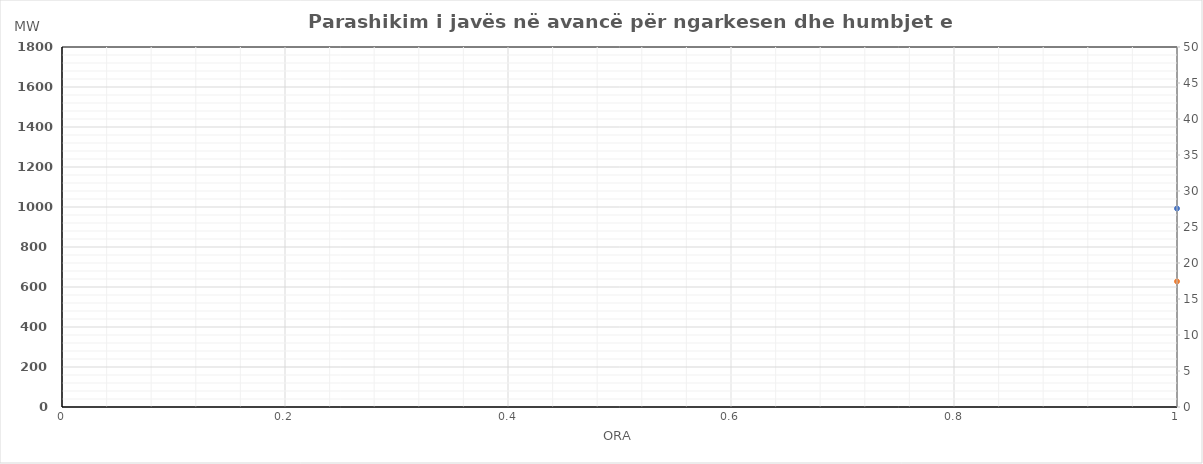
| Category | Ngarkesa (MWh) |
|---|---|
| 0 | 627.937 |
| 1 | 544.82 |
| 2 | 505.534 |
| 3 | 494.173 |
| 4 | 499.324 |
| 5 | 563.603 |
| 6 | 755.438 |
| 7 | 1010.254 |
| 8 | 1121.056 |
| 9 | 1144.751 |
| 10 | 1128.008 |
| 11 | 1115.397 |
| 12 | 1130.338 |
| 13 | 1166.992 |
| 14 | 1198.143 |
| 15 | 1212.175 |
| 16 | 1253.99 |
| 17 | 1311.956 |
| 18 | 1312.097 |
| 19 | 1300.361 |
| 20 | 1265.792 |
| 21 | 1157.814 |
| 22 | 985.576 |
| 23 | 784.612 |
| 24 | 646.145 |
| 25 | 568.616 |
| 26 | 531.638 |
| 27 | 518.668 |
| 28 | 525.293 |
| 29 | 589.999 |
| 30 | 788.249 |
| 31 | 1071.961 |
| 32 | 1162.219 |
| 33 | 1146.982 |
| 34 | 1109.085 |
| 35 | 1078.535 |
| 36 | 1058.867 |
| 37 | 1084.38 |
| 38 | 1112.88 |
| 39 | 1142.433 |
| 40 | 1231.431 |
| 41 | 1357.425 |
| 42 | 1386.465 |
| 43 | 1384.973 |
| 44 | 1348.599 |
| 45 | 1230.955 |
| 46 | 1033.728 |
| 47 | 824.857 |
| 48 | 672.078 |
| 49 | 584.835 |
| 50 | 545.187 |
| 51 | 531.567 |
| 52 | 541.403 |
| 53 | 614.621 |
| 54 | 824.423 |
| 55 | 1119.1 |
| 56 | 1230.965 |
| 57 | 1221.58 |
| 58 | 1162.316 |
| 59 | 1106.923 |
| 60 | 1092.254 |
| 61 | 1129.932 |
| 62 | 1172.964 |
| 63 | 1223.518 |
| 64 | 1315.167 |
| 65 | 1428.534 |
| 66 | 1446.04 |
| 67 | 1420.435 |
| 68 | 1401.155 |
| 69 | 1287.653 |
| 70 | 1084.506 |
| 71 | 858.671 |
| 72 | 680.906 |
| 73 | 593.011 |
| 74 | 549.966 |
| 75 | 536.067 |
| 76 | 552.141 |
| 77 | 626.603 |
| 78 | 831.602 |
| 79 | 1135.372 |
| 80 | 1252.034 |
| 81 | 1255.731 |
| 82 | 1195.692 |
| 83 | 1151.128 |
| 84 | 1135.219 |
| 85 | 1139.412 |
| 86 | 1199.589 |
| 87 | 1245.152 |
| 88 | 1320.701 |
| 89 | 1429.118 |
| 90 | 1444.07 |
| 91 | 1425.546 |
| 92 | 1399.798 |
| 93 | 1293.179 |
| 94 | 1079.613 |
| 95 | 850.257 |
| 96 | 697.396 |
| 97 | 610.383 |
| 98 | 568.257 |
| 99 | 558.07 |
| 100 | 568.844 |
| 101 | 640.726 |
| 102 | 858.474 |
| 103 | 1170.161 |
| 104 | 1290.472 |
| 105 | 1273.189 |
| 106 | 1207.4 |
| 107 | 1147.035 |
| 108 | 1115.565 |
| 109 | 1138.284 |
| 110 | 1153.815 |
| 111 | 1209.674 |
| 112 | 1315.129 |
| 113 | 1456.742 |
| 114 | 1467.837 |
| 115 | 1449.925 |
| 116 | 1407.8 |
| 117 | 1287.41 |
| 118 | 1094.36 |
| 119 | 890.681 |
| 120 | 728.942 |
| 121 | 634.007 |
| 122 | 588.502 |
| 123 | 575.186 |
| 124 | 584.959 |
| 125 | 649.224 |
| 126 | 807.032 |
| 127 | 1051.298 |
| 128 | 1258.83 |
| 129 | 1309.435 |
| 130 | 1264.855 |
| 131 | 1214.74 |
| 132 | 1190.872 |
| 133 | 1209.627 |
| 134 | 1231.789 |
| 135 | 1282.625 |
| 136 | 1378.905 |
| 137 | 1496.949 |
| 138 | 1511.304 |
| 139 | 1494.908 |
| 140 | 1449.115 |
| 141 | 1320.447 |
| 142 | 1168.667 |
| 143 | 999.552 |
| 144 | 840.052 |
| 145 | 727.976 |
| 146 | 630.861 |
| 147 | 590.465 |
| 148 | 587.394 |
| 149 | 628.361 |
| 150 | 741.626 |
| 151 | 928.418 |
| 152 | 1121.184 |
| 153 | 1245.165 |
| 154 | 1304.922 |
| 155 | 1306.256 |
| 156 | 1282.239 |
| 157 | 1316.007 |
| 158 | 1304.077 |
| 159 | 1325.085 |
| 160 | 1404.744 |
| 161 | 1514.256 |
| 162 | 1523.86 |
| 163 | 1519.891 |
| 164 | 1465.776 |
| 165 | 1323.289 |
| 166 | 1125.877 |
| 167 | 887.064 |